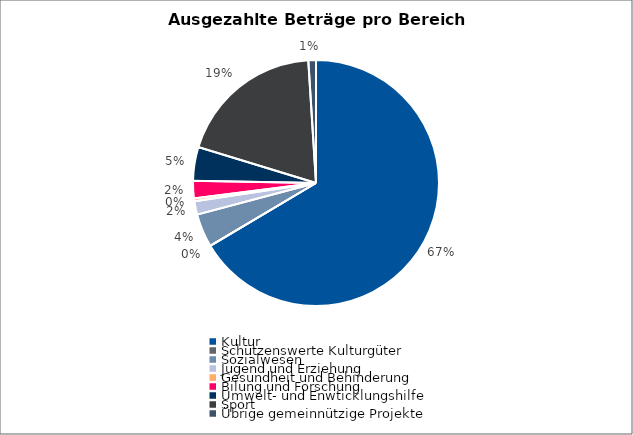
| Category | Series 0 |
|---|---|
| Kultur | 2029484 |
| Schützenswerte Kulturgüter | 0 |
| Sozialwesen | 133898 |
| Jugend und Erziehung | 53950 |
| Gesundheit und Behinderung | 11200 |
| Bilung und Forschung | 70000 |
| Umwelt- und Enwticklungshilfe | 135000 |
| Sport | 588852 |
| Übrige gemeinnützige Projekte | 30650 |